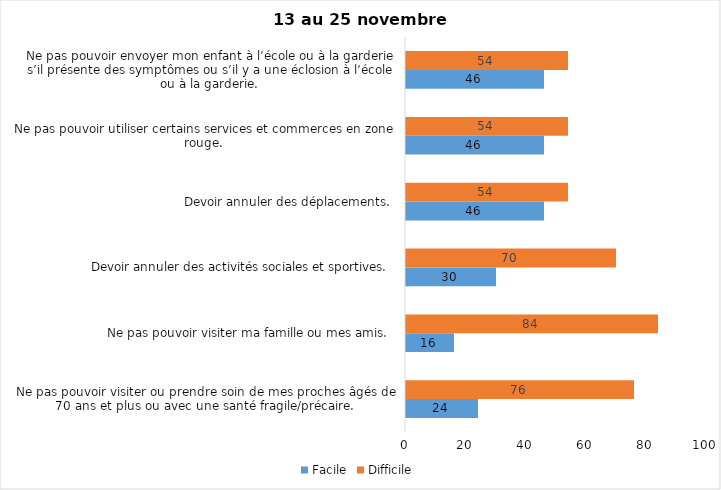
| Category | Facile | Difficile |
|---|---|---|
| Ne pas pouvoir visiter ou prendre soin de mes proches âgés de 70 ans et plus ou avec une santé fragile/précaire.  | 24 | 76 |
| Ne pas pouvoir visiter ma famille ou mes amis.  | 16 | 84 |
| Devoir annuler des activités sociales et sportives.  | 30 | 70 |
| Devoir annuler des déplacements.  | 46 | 54 |
| Ne pas pouvoir utiliser certains services et commerces en zone rouge.  | 46 | 54 |
| Ne pas pouvoir envoyer mon enfant à l’école ou à la garderie s’il présente des symptômes ou s’il y a une éclosion à l’école ou à la garderie.  | 46 | 54 |